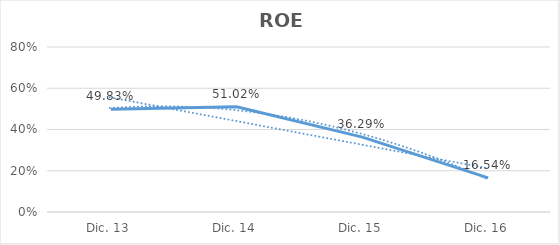
| Category | Series 0 |
|---|---|
| Dic. 13 | 0.498 |
| Dic. 14 | 0.51 |
| Dic. 15 | 0.363 |
| Dic. 16 | 0.165 |